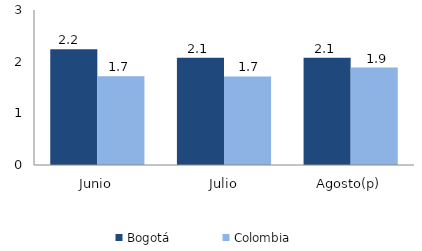
| Category | Bogotá | Colombia |
|---|---|---|
| Junio | 2.241 | 1.719 |
| Julio | 2.078 | 1.713 |
| Agosto(p) | 2.076 | 1.886 |